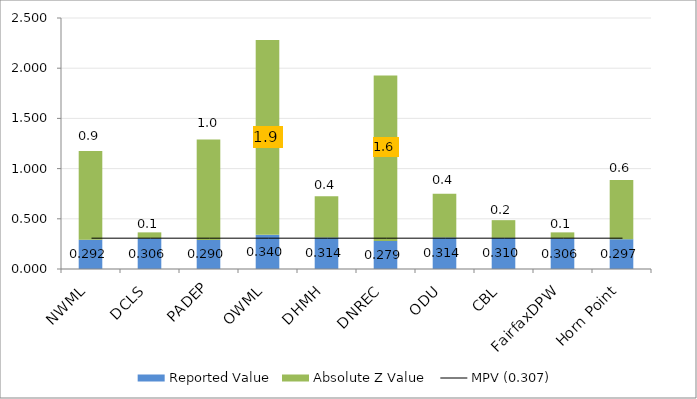
| Category | Reported Value | Absolute Z Value  |
|---|---|---|
| NWML | 0.292 | 0.882 |
| DCLS | 0.306 | 0.059 |
| PADEP | 0.29 | 1 |
| OWML | 0.34 | 1.941 |
| DHMH | 0.314 | 0.412 |
| DNREC | 0.279 | 1.647 |
| ODU | 0.314 | 0.435 |
| CBL | 0.31 | 0.176 |
| FairfaxDPW | 0.306 | 0.059 |
| Horn Point | 0.297 | 0.588 |